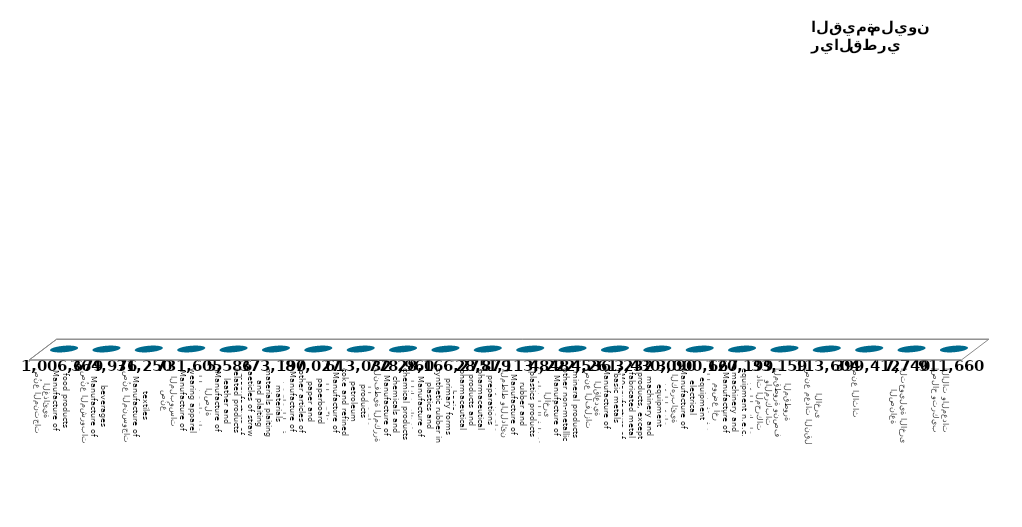
| Category | Column2 |
|---|---|
| صُنع المنتجات الغذائية
Manufacture of food products | 1006679 |
| صُنع المشروبات
Manufacture of beverages | 364976 |
| صُنع المنسوجات
Manufacture of textiles | 31250 |
| صُنع الملبوسات
Manufacture of wearing apparel | 731605 |
| صُنع المنتجات الجلدية والمنتجات ذات الصلة
Manufacture of leather and related products | 5586 |
| صُنع الخشب ومنتجات الخشب والفلين ، باستثناء الأثاث ، صُنع أصناف من القش ومواد الضفر
Manufacture of wood and of products of wood and cork, except furniture, manufacture of aeticles of straw and plaiting materials plaiting materials | 373190 |
| صُنع الورق ومنتجات الورق
Manufacture of other articles of paper and paperboard | 87027 |
| الطباعة واستنساخ وسائط الأعلام المسجّلة
Manufacture of coke and refined petroleum products | 613032 |
| صنع فحم الكوك والمنتجات النفطية المكررة
Manufacture of chemicals and chemical products | 778960 |
| صُنع المواد الكيميائية والمنتجات الكيميائية
Manufacture of plastics and synthetic rubber in primary forms | 28166275 |
| صنع المنتجات الصيدلانية الأساسية والمستحضرات الصيدلانية
Manufacture of basic pharmaceutical products and pharmaceutical preparations | 28879 |
| صنع منتجات المطاط واللدائن
Manufacture of rubber and plastics products | 1113848 |
| صنع منتجات المعادن اللافلزية الأخرى
Manufacture of other non-metallic mineral products | 4222536 |
| صنع الفلزات القاعدية
Manufacture of basic metals | 4261232 |
| صنع منتجات المعادن المشكلة باستثناء الآلات والمعدات
M0anufacture of fabricated metal products, except machinery and equipment | 3430090 |
| صنع المعدات الكهربائية
Manufacture of electrical equipment | 3000667 |
| صنع الآلات والمعدات غير المصنفة في موضع أخر
Manufacture of machinery and equipment n.e.c. | 120199 |
| صنع المركبات ذات المحركات والمركبات المقطورة ونصف المقطورة | 33159 |
| صنع معدات النقل الأخرى | 113604 |
| صنع الأثاث | 399412 |
| الصناعة التحويلية الأخرى | 7740 |
| إصلاح وتركيب الآلات والمعدات | 911660 |